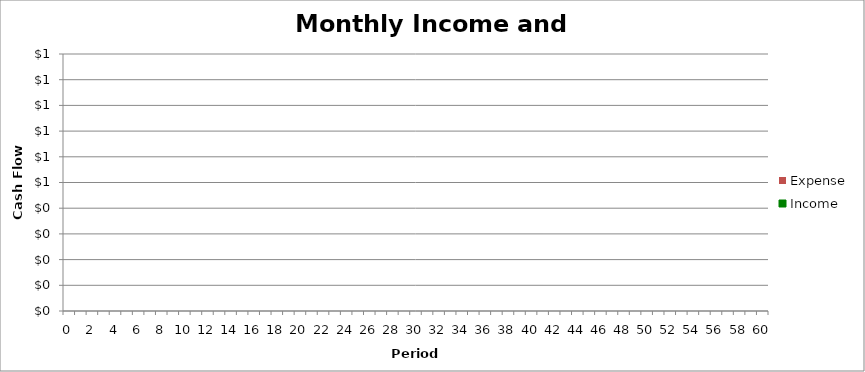
| Category | Income | Expense |
|---|---|---|
| 0.0 | 0 | 0 |
| 1.0 | 0 | 0 |
| 2.0 | 0 | 0 |
| 3.0 | 0 | 0 |
| 4.0 | 0 | 0 |
| 5.0 | 0 | 0 |
| 6.0 | 0 | 0 |
| 7.0 | 0 | 0 |
| 8.0 | 0 | 0 |
| 9.0 | 0 | 0 |
| 10.0 | 0 | 0 |
| 11.0 | 0 | 0 |
| 12.0 | 0 | 0 |
| 13.0 | 0 | 0 |
| 14.0 | 0 | 0 |
| 15.0 | 0 | 0 |
| 16.0 | 0 | 0 |
| 17.0 | 0 | 0 |
| 18.0 | 0 | 0 |
| 19.0 | 0 | 0 |
| 20.0 | 0 | 0 |
| 21.0 | 0 | 0 |
| 22.0 | 0 | 0 |
| 23.0 | 0 | 0 |
| 24.0 | 0 | 0 |
| 25.0 | 0 | 0 |
| 26.0 | 0 | 0 |
| 27.0 | 0 | 0 |
| 28.0 | 0 | 0 |
| 29.0 | 0 | 0 |
| 30.0 | 0 | 0 |
| 31.0 | 0 | 0 |
| 32.0 | 0 | 0 |
| 33.0 | 0 | 0 |
| 34.0 | 0 | 0 |
| 35.0 | 0 | 0 |
| 36.0 | 0 | 0 |
| 37.0 | 0 | 0 |
| 38.0 | 0 | 0 |
| 39.0 | 0 | 0 |
| 40.0 | 0 | 0 |
| 41.0 | 0 | 0 |
| 42.0 | 0 | 0 |
| 43.0 | 0 | 0 |
| 44.0 | 0 | 0 |
| 45.0 | 0 | 0 |
| 46.0 | 0 | 0 |
| 47.0 | 0 | 0 |
| 48.0 | 0 | 0 |
| 49.0 | 0 | 0 |
| 50.0 | 0 | 0 |
| 51.0 | 0 | 0 |
| 52.0 | 0 | 0 |
| 53.0 | 0 | 0 |
| 54.0 | 0 | 0 |
| 55.0 | 0 | 0 |
| 56.0 | 0 | 0 |
| 57.0 | 0 | 0 |
| 58.0 | 0 | 0 |
| 59.0 | 0 | 0 |
| 60.0 | 0 | 0 |